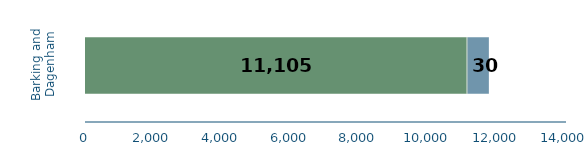
| Category | Series 0 | Series 1 | Series 2 |
|---|---|---|---|
| Barking and Dagenham | 11105 | 30 | 620 |